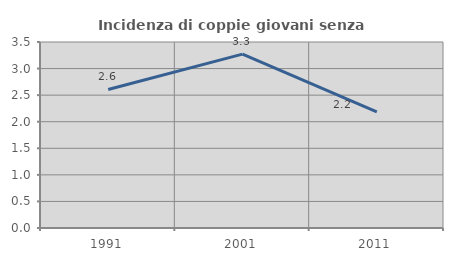
| Category | Incidenza di coppie giovani senza figli |
|---|---|
| 1991.0 | 2.607 |
| 2001.0 | 3.272 |
| 2011.0 | 2.184 |